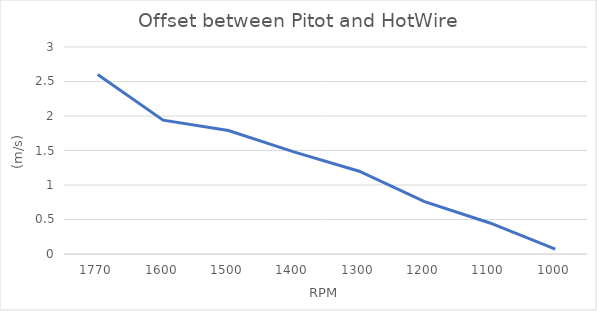
| Category | 2.6 |
|---|---|
| 1770.0 | 2.6 |
| 1600.0 | 1.94 |
| 1500.0 | 1.79 |
| 1400.0 | 1.48 |
| 1300.0 | 1.2 |
| 1200.0 | 0.76 |
| 1100.0 | 0.45 |
| 1000.0 | 0.07 |